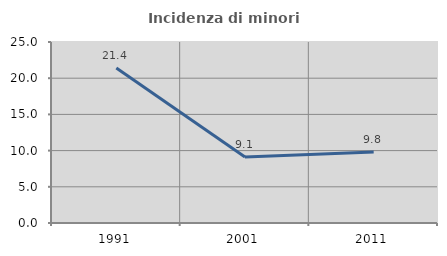
| Category | Incidenza di minori stranieri |
|---|---|
| 1991.0 | 21.401 |
| 2001.0 | 9.104 |
| 2011.0 | 9.804 |